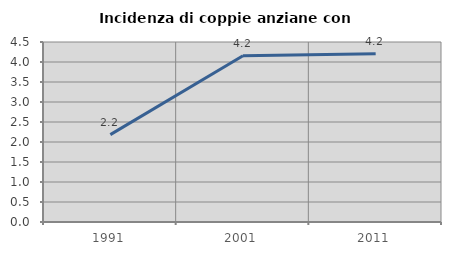
| Category | Incidenza di coppie anziane con figli |
|---|---|
| 1991.0 | 2.185 |
| 2001.0 | 4.158 |
| 2011.0 | 4.209 |